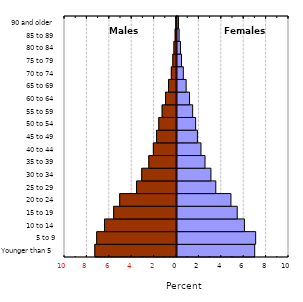
| Category | Series 0 |
|---|---|
| Younger than 5 | 6.938 |
| 5 to 9 | 7.023 |
| 10 to 14 | 6.019 |
| 15 to 19 | 5.378 |
| 20 to 24 | 4.816 |
| 25 to 29 | 3.465 |
| 30 to 34 | 3.029 |
| 35 to 39 | 2.502 |
| 40 to 44 | 2.14 |
| 45 to 49 | 1.823 |
| 50 to 54 | 1.665 |
| 55 to 59 | 1.398 |
| 60 to 64 | 1.118 |
| 65 to 69 | 0.817 |
| 70 to 74 | 0.565 |
| 75 to 79 | 0.404 |
| 80 to 84 | 0.315 |
| 85 to 89 | 0.189 |
| 90 and older | 0.132 |